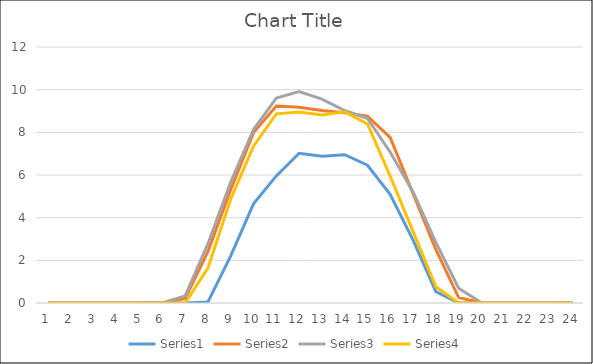
| Category | Series 0 | Series 1 | Series 2 | Series 3 |
|---|---|---|---|---|
| 0 | 0 | 0 | 0 | 0 |
| 1 | 0 | 0 | 0 | 0 |
| 2 | 0 | 0 | 0 | 0 |
| 3 | 0 | 0 | 0 | 0 |
| 4 | 0 | 0 | 0 | 0 |
| 5 | 0 | 0.001 | 0.008 | 0 |
| 6 | 0 | 0.216 | 0.332 | 0.005 |
| 7 | 0.05 | 2.407 | 2.779 | 1.64 |
| 8 | 2.209 | 5.316 | 5.666 | 4.879 |
| 9 | 4.647 | 7.987 | 8.132 | 7.348 |
| 10 | 5.958 | 9.23 | 9.607 | 8.868 |
| 11 | 7.018 | 9.176 | 9.908 | 8.957 |
| 12 | 6.877 | 9.028 | 9.557 | 8.817 |
| 13 | 6.949 | 8.917 | 9.024 | 8.961 |
| 14 | 6.457 | 8.754 | 8.648 | 8.39 |
| 15 | 5.084 | 7.755 | 7.068 | 5.938 |
| 16 | 2.951 | 5.124 | 5.201 | 3.346 |
| 17 | 0.535 | 2.5 | 2.845 | 0.765 |
| 18 | 0 | 0.255 | 0.695 | 0.001 |
| 19 | 0 | 0 | 0.005 | 0 |
| 20 | 0 | 0 | 0 | 0 |
| 21 | 0 | 0 | 0 | 0 |
| 22 | 0 | 0 | 0 | 0 |
| 23 | 0 | 0 | 0 | 0 |